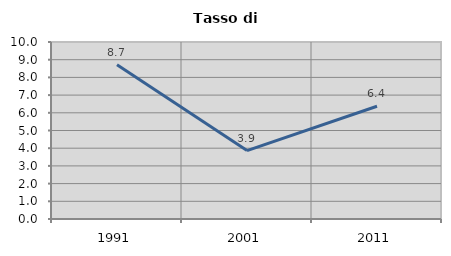
| Category | Tasso di disoccupazione   |
|---|---|
| 1991.0 | 8.719 |
| 2001.0 | 3.865 |
| 2011.0 | 6.37 |